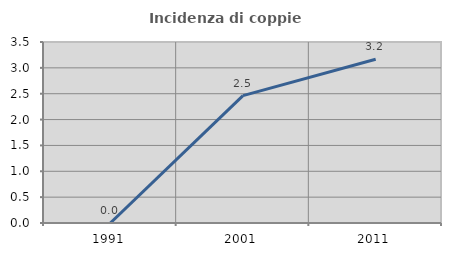
| Category | Incidenza di coppie miste |
|---|---|
| 1991.0 | 0 |
| 2001.0 | 2.463 |
| 2011.0 | 3.167 |